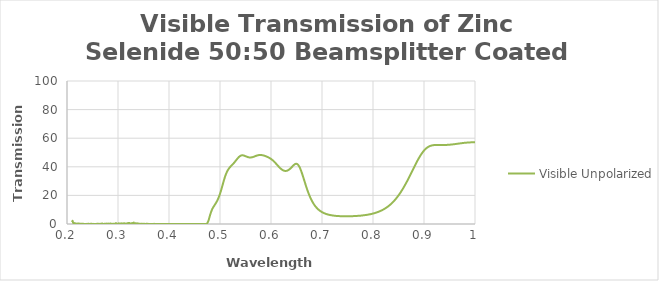
| Category | Visible Unpolarized |
|---|---|
| 0.21 | 1.317 |
| 0.211 | 2.221 |
| 0.212 | 0.77 |
| 0.213 | 0.683 |
| 0.214 | 0.649 |
| 0.215 | 0.59 |
| 0.216 | 0.46 |
| 0.217 | 0.397 |
| 0.218 | 0.26 |
| 0.219 | 0.055 |
| 0.22 | 0.344 |
| 0.221 | 0.15 |
| 0.222 | 0.234 |
| 0.223 | 0.441 |
| 0.224 | 0.07 |
| 0.225 | 0.092 |
| 0.226 | 0.228 |
| 0.227 | 0.069 |
| 0.228 | 0.159 |
| 0.229 | 0.081 |
| 0.23 | 0.14 |
| 0.231 | 0.153 |
| 0.232 | 0.121 |
| 0.233 | 0.033 |
| 0.234 | 0.076 |
| 0.235 | 0.037 |
| 0.236 | 0.044 |
| 0.237 | 0.05 |
| 0.238 | 0.085 |
| 0.239 | 0.085 |
| 0.24 | 0.087 |
| 0.241 | 0.031 |
| 0.242 | 0.12 |
| 0.243 | 0.072 |
| 0.244 | 0.049 |
| 0.245 | 0.101 |
| 0.246 | 0.072 |
| 0.247 | 0.121 |
| 0.248 | 0.109 |
| 0.249 | 0.078 |
| 0.25 | 0.02 |
| 0.251 | 0.117 |
| 0.252 | 0.011 |
| 0.253 | 0.066 |
| 0.254 | 0.064 |
| 0.255 | 0.036 |
| 0.256 | 0.061 |
| 0.257 | 0.031 |
| 0.258 | 0.072 |
| 0.259 | 0.144 |
| 0.26 | 0.174 |
| 0.261 | 0.055 |
| 0.262 | 0.1 |
| 0.263 | 0.116 |
| 0.264 | 0.01 |
| 0.265 | 0.061 |
| 0.266 | 0.132 |
| 0.267 | 0.217 |
| 0.268 | 0.168 |
| 0.269 | 0.366 |
| 0.27 | 0.038 |
| 0.271 | 0.035 |
| 0.272 | 0.074 |
| 0.273 | 0.174 |
| 0.274 | 0.219 |
| 0.275 | 0.103 |
| 0.276 | 0.213 |
| 0.277 | 0.147 |
| 0.278 | 0.303 |
| 0.279 | 0.16 |
| 0.28 | 0.218 |
| 0.281 | 0.156 |
| 0.282 | 0.283 |
| 0.283 | 0.181 |
| 0.284 | 0.256 |
| 0.285 | 0.385 |
| 0.286 | 0.087 |
| 0.287 | 0.161 |
| 0.288 | 0.155 |
| 0.289 | 0.032 |
| 0.29 | 0.147 |
| 0.291 | 0.205 |
| 0.292 | 0.177 |
| 0.293 | 0.085 |
| 0.294 | 0.22 |
| 0.295 | 0.172 |
| 0.296 | 0.655 |
| 0.297 | 0.181 |
| 0.298 | 0.252 |
| 0.299 | 0.174 |
| 0.3 | 0.078 |
| 0.301 | 0.352 |
| 0.302 | 0.469 |
| 0.303 | 0.138 |
| 0.304 | 0.117 |
| 0.305 | 0.117 |
| 0.306 | 0.467 |
| 0.307 | 0.349 |
| 0.308 | 0.213 |
| 0.309 | 0.401 |
| 0.31 | 0.056 |
| 0.311 | 0.335 |
| 0.312 | 0.56 |
| 0.313 | 0.114 |
| 0.314 | 0.092 |
| 0.315 | 0.333 |
| 0.316 | 0.381 |
| 0.317 | 0.302 |
| 0.318 | 0.356 |
| 0.319 | 0.38 |
| 0.32 | 0.73 |
| 0.321 | 0.239 |
| 0.322 | 0.708 |
| 0.323 | 0.597 |
| 0.324 | 0.242 |
| 0.325 | 0.357 |
| 0.326 | 0.419 |
| 0.327 | 0.544 |
| 0.328 | 0.325 |
| 0.329 | 0.709 |
| 0.33 | 0.599 |
| 0.331 | 1.01 |
| 0.332 | 0.335 |
| 0.333 | 0.295 |
| 0.334 | 0.191 |
| 0.335 | 0.61 |
| 0.336 | 0.414 |
| 0.337 | 0.374 |
| 0.338 | 0.343 |
| 0.339 | 0.465 |
| 0.34 | 0.068 |
| 0.341 | 0.136 |
| 0.342 | 0.227 |
| 0.343 | 0.067 |
| 0.344 | 0.051 |
| 0.345 | 0.229 |
| 0.346 | 0.08 |
| 0.347 | 0.141 |
| 0.348 | 0.024 |
| 0.349 | 0.099 |
| 0.35 | 0.104 |
| 0.351 | 0.038 |
| 0.352 | 0.111 |
| 0.353 | 0.086 |
| 0.354 | 0.039 |
| 0.355 | 0.112 |
| 0.356 | 0.074 |
| 0.357 | 0.181 |
| 0.358 | 0.063 |
| 0.359 | 0.088 |
| 0.36 | 0.062 |
| 0.361 | 0.041 |
| 0.362 | 0.068 |
| 0.363 | 0.04 |
| 0.364 | 0.007 |
| 0.365 | 0.061 |
| 0.366 | 0.042 |
| 0.367 | 0.02 |
| 0.368 | 0.034 |
| 0.369 | 0.072 |
| 0.37 | 0.078 |
| 0.371 | 0.101 |
| 0.372 | 0.039 |
| 0.373 | 0.047 |
| 0.374 | 0.014 |
| 0.375 | 0.04 |
| 0.376 | 0.053 |
| 0.377 | 0.031 |
| 0.378 | 0.026 |
| 0.379 | 0.054 |
| 0.38 | 0.056 |
| 0.381 | 0.077 |
| 0.382 | 0.078 |
| 0.383 | 0.039 |
| 0.384 | 0.022 |
| 0.385 | 0.077 |
| 0.386 | 0.024 |
| 0.387 | 0.005 |
| 0.388 | 0.028 |
| 0.389 | 0.031 |
| 0.39 | 0.024 |
| 0.391 | 0.047 |
| 0.392 | 0.022 |
| 0.393 | 0.033 |
| 0.394 | 0.036 |
| 0.395 | 0.054 |
| 0.396 | 0.041 |
| 0.397 | 0.036 |
| 0.398 | 0.005 |
| 0.399 | 0.025 |
| 0.4 | 0.022 |
| 0.401 | 0.031 |
| 0.402 | 0.005 |
| 0.403 | 0.029 |
| 0.404 | 0.032 |
| 0.405 | 0.025 |
| 0.406 | 0.011 |
| 0.407 | 0.023 |
| 0.408 | 0.035 |
| 0.409 | 0.014 |
| 0.41 | 0.03 |
| 0.411 | 0.053 |
| 0.412 | 0.042 |
| 0.413 | 0.015 |
| 0.414 | 0.02 |
| 0.415 | 0.015 |
| 0.416 | 0.045 |
| 0.417 | 0.006 |
| 0.418 | 0.026 |
| 0.419 | 0.03 |
| 0.42 | 0.019 |
| 0.421 | 0.014 |
| 0.422 | 0.008 |
| 0.423 | 0.026 |
| 0.424 | 0.018 |
| 0.425 | 0.01 |
| 0.426 | 0.008 |
| 0.427 | 0.015 |
| 0.428 | 0.016 |
| 0.429 | 0.01 |
| 0.43 | 0.028 |
| 0.431 | 0.001 |
| 0.432 | 0.01 |
| 0.433 | 0.027 |
| 0.434 | 0.019 |
| 0.435 | 0.003 |
| 0.436 | 0.019 |
| 0.437 | 0.025 |
| 0.438 | 0.022 |
| 0.439 | 0.035 |
| 0.44 | 0.01 |
| 0.441 | 0.031 |
| 0.442 | 0.018 |
| 0.443 | 0.029 |
| 0.444 | 0.004 |
| 0.445 | 0.011 |
| 0.446 | 0.011 |
| 0.447 | 0.029 |
| 0.448 | 0.026 |
| 0.449 | 0.014 |
| 0.45 | 0.008 |
| 0.451 | 0.033 |
| 0.452 | 0.015 |
| 0.453 | 0.035 |
| 0.454 | 0.029 |
| 0.455 | 0.01 |
| 0.456 | 0.014 |
| 0.457 | 0.006 |
| 0.458 | 0.012 |
| 0.459 | 0.003 |
| 0.46 | 0.025 |
| 0.461 | 0.038 |
| 0.462 | 0.001 |
| 0.463 | 0.025 |
| 0.464 | 0.015 |
| 0.465 | 0.022 |
| 0.466 | 0.03 |
| 0.467 | 0.025 |
| 0.468 | 0.006 |
| 0.469 | 0.018 |
| 0.47 | 0.031 |
| 0.471 | 0.02 |
| 0.472 | 0.031 |
| 0.473 | 0.052 |
| 0.474 | 0.209 |
| 0.475 | 0.56 |
| 0.476 | 1.153 |
| 0.477 | 1.98 |
| 0.478 | 3.05 |
| 0.479 | 4.266 |
| 0.48 | 5.544 |
| 0.481 | 6.753 |
| 0.482 | 7.889 |
| 0.483 | 8.865 |
| 0.484 | 9.759 |
| 0.485 | 10.554 |
| 0.486 | 11.24 |
| 0.487 | 11.858 |
| 0.488 | 12.453 |
| 0.489 | 12.985 |
| 0.49 | 13.526 |
| 0.491 | 14.083 |
| 0.492 | 14.63 |
| 0.493 | 15.269 |
| 0.494 | 15.914 |
| 0.495 | 16.599 |
| 0.496 | 17.392 |
| 0.497 | 18.22 |
| 0.498 | 19.13 |
| 0.499 | 20.087 |
| 0.5 | 21.113 |
| 0.501 | 22.236 |
| 0.502 | 23.399 |
| 0.503 | 24.612 |
| 0.504 | 25.876 |
| 0.505 | 27.14 |
| 0.506 | 28.432 |
| 0.507 | 29.683 |
| 0.508 | 30.923 |
| 0.509 | 32.092 |
| 0.51 | 33.188 |
| 0.511 | 34.206 |
| 0.512 | 35.119 |
| 0.513 | 35.959 |
| 0.514 | 36.734 |
| 0.515 | 37.385 |
| 0.516 | 37.997 |
| 0.517 | 38.544 |
| 0.518 | 39.04 |
| 0.519 | 39.49 |
| 0.52 | 39.906 |
| 0.521 | 40.302 |
| 0.522 | 40.676 |
| 0.523 | 41.048 |
| 0.524 | 41.399 |
| 0.525 | 41.766 |
| 0.526 | 42.151 |
| 0.527 | 42.565 |
| 0.528 | 42.966 |
| 0.529 | 43.397 |
| 0.53 | 43.839 |
| 0.531 | 44.28 |
| 0.532 | 44.749 |
| 0.533 | 45.207 |
| 0.534 | 45.639 |
| 0.535 | 46.078 |
| 0.536 | 46.463 |
| 0.537 | 46.838 |
| 0.538 | 47.162 |
| 0.539 | 47.43 |
| 0.54 | 47.651 |
| 0.541 | 47.832 |
| 0.542 | 47.957 |
| 0.543 | 48.012 |
| 0.544 | 48.024 |
| 0.545 | 48.018 |
| 0.546 | 47.94 |
| 0.547 | 47.845 |
| 0.548 | 47.724 |
| 0.549 | 47.586 |
| 0.55 | 47.44 |
| 0.551 | 47.276 |
| 0.552 | 47.134 |
| 0.553 | 46.984 |
| 0.554 | 46.871 |
| 0.555 | 46.748 |
| 0.556 | 46.657 |
| 0.557 | 46.577 |
| 0.558 | 46.547 |
| 0.559 | 46.531 |
| 0.56 | 46.539 |
| 0.561 | 46.567 |
| 0.562 | 46.614 |
| 0.563 | 46.69 |
| 0.564 | 46.787 |
| 0.565 | 46.897 |
| 0.566 | 47.021 |
| 0.567 | 47.142 |
| 0.568 | 47.278 |
| 0.569 | 47.421 |
| 0.57 | 47.573 |
| 0.571 | 47.684 |
| 0.572 | 47.817 |
| 0.573 | 47.935 |
| 0.574 | 48.02 |
| 0.575 | 48.103 |
| 0.576 | 48.18 |
| 0.577 | 48.213 |
| 0.578 | 48.246 |
| 0.579 | 48.265 |
| 0.58 | 48.243 |
| 0.581 | 48.221 |
| 0.582 | 48.18 |
| 0.583 | 48.113 |
| 0.584 | 48.039 |
| 0.585 | 47.96 |
| 0.586 | 47.854 |
| 0.587 | 47.753 |
| 0.588 | 47.634 |
| 0.589 | 47.495 |
| 0.59 | 47.362 |
| 0.591 | 47.222 |
| 0.592 | 47.085 |
| 0.593 | 46.903 |
| 0.594 | 46.752 |
| 0.595 | 46.571 |
| 0.596 | 46.374 |
| 0.597 | 46.18 |
| 0.598 | 45.958 |
| 0.599 | 45.742 |
| 0.6 | 45.488 |
| 0.601 | 45.229 |
| 0.602 | 44.954 |
| 0.603 | 44.654 |
| 0.604 | 44.34 |
| 0.605 | 44.026 |
| 0.606 | 43.662 |
| 0.607 | 43.314 |
| 0.608 | 42.939 |
| 0.609 | 42.549 |
| 0.61 | 42.152 |
| 0.611 | 41.757 |
| 0.612 | 41.349 |
| 0.613 | 40.957 |
| 0.614 | 40.558 |
| 0.615 | 40.172 |
| 0.616 | 39.79 |
| 0.617 | 39.437 |
| 0.618 | 39.071 |
| 0.619 | 38.754 |
| 0.62 | 38.446 |
| 0.621 | 38.173 |
| 0.622 | 37.916 |
| 0.623 | 37.699 |
| 0.624 | 37.513 |
| 0.625 | 37.356 |
| 0.626 | 37.234 |
| 0.627 | 37.162 |
| 0.628 | 37.122 |
| 0.629 | 37.116 |
| 0.63 | 37.156 |
| 0.631 | 37.234 |
| 0.632 | 37.341 |
| 0.633 | 37.496 |
| 0.634 | 37.692 |
| 0.635 | 37.933 |
| 0.636 | 38.179 |
| 0.637 | 38.482 |
| 0.638 | 38.799 |
| 0.639 | 39.141 |
| 0.64 | 39.497 |
| 0.641 | 39.891 |
| 0.642 | 40.262 |
| 0.643 | 40.645 |
| 0.644 | 41.019 |
| 0.645 | 41.334 |
| 0.646 | 41.603 |
| 0.647 | 41.843 |
| 0.648 | 42.004 |
| 0.649 | 42.078 |
| 0.65 | 42.06 |
| 0.651 | 41.949 |
| 0.652 | 41.726 |
| 0.653 | 41.405 |
| 0.654 | 40.961 |
| 0.655 | 40.397 |
| 0.656 | 39.741 |
| 0.657 | 38.984 |
| 0.658 | 38.139 |
| 0.659 | 37.217 |
| 0.66 | 36.238 |
| 0.661 | 35.192 |
| 0.662 | 34.107 |
| 0.663 | 32.987 |
| 0.664 | 31.859 |
| 0.665 | 30.694 |
| 0.666 | 29.575 |
| 0.667 | 28.423 |
| 0.668 | 27.302 |
| 0.669 | 26.206 |
| 0.67 | 25.123 |
| 0.671 | 24.077 |
| 0.672 | 23.059 |
| 0.673 | 22.075 |
| 0.674 | 21.134 |
| 0.675 | 20.235 |
| 0.676 | 19.376 |
| 0.677 | 18.571 |
| 0.678 | 17.768 |
| 0.679 | 17.034 |
| 0.68 | 16.334 |
| 0.681 | 15.674 |
| 0.682 | 15.06 |
| 0.683 | 14.436 |
| 0.684 | 13.889 |
| 0.685 | 13.353 |
| 0.686 | 12.849 |
| 0.687 | 12.382 |
| 0.688 | 11.946 |
| 0.689 | 11.533 |
| 0.69 | 11.151 |
| 0.691 | 10.765 |
| 0.692 | 10.428 |
| 0.693 | 10.109 |
| 0.694 | 9.796 |
| 0.695 | 9.516 |
| 0.696 | 9.251 |
| 0.697 | 9.003 |
| 0.698 | 8.749 |
| 0.699 | 8.547 |
| 0.7 | 8.315 |
| 0.701 | 8.115 |
| 0.702 | 7.924 |
| 0.703 | 7.756 |
| 0.704 | 7.607 |
| 0.705 | 7.455 |
| 0.706 | 7.308 |
| 0.707 | 7.163 |
| 0.708 | 7.036 |
| 0.709 | 6.93 |
| 0.71 | 6.816 |
| 0.711 | 6.705 |
| 0.712 | 6.616 |
| 0.713 | 6.501 |
| 0.714 | 6.426 |
| 0.715 | 6.348 |
| 0.716 | 6.263 |
| 0.717 | 6.185 |
| 0.718 | 6.133 |
| 0.719 | 6.066 |
| 0.72 | 6.018 |
| 0.721 | 5.958 |
| 0.722 | 5.881 |
| 0.723 | 5.858 |
| 0.724 | 5.824 |
| 0.725 | 5.759 |
| 0.726 | 5.715 |
| 0.727 | 5.674 |
| 0.728 | 5.666 |
| 0.729 | 5.651 |
| 0.73 | 5.614 |
| 0.731 | 5.565 |
| 0.732 | 5.549 |
| 0.733 | 5.543 |
| 0.734 | 5.515 |
| 0.735 | 5.489 |
| 0.736 | 5.478 |
| 0.737 | 5.462 |
| 0.738 | 5.452 |
| 0.739 | 5.468 |
| 0.74 | 5.452 |
| 0.741 | 5.44 |
| 0.742 | 5.415 |
| 0.743 | 5.425 |
| 0.744 | 5.427 |
| 0.745 | 5.438 |
| 0.746 | 5.393 |
| 0.747 | 5.401 |
| 0.748 | 5.41 |
| 0.749 | 5.416 |
| 0.75 | 5.406 |
| 0.751 | 5.415 |
| 0.752 | 5.399 |
| 0.753 | 5.416 |
| 0.754 | 5.459 |
| 0.755 | 5.424 |
| 0.756 | 5.436 |
| 0.757 | 5.432 |
| 0.758 | 5.455 |
| 0.759 | 5.495 |
| 0.76 | 5.487 |
| 0.761 | 5.501 |
| 0.762 | 5.524 |
| 0.763 | 5.535 |
| 0.764 | 5.547 |
| 0.765 | 5.57 |
| 0.766 | 5.594 |
| 0.767 | 5.621 |
| 0.768 | 5.618 |
| 0.769 | 5.659 |
| 0.77 | 5.687 |
| 0.771 | 5.713 |
| 0.772 | 5.731 |
| 0.773 | 5.792 |
| 0.774 | 5.777 |
| 0.775 | 5.832 |
| 0.776 | 5.848 |
| 0.777 | 5.93 |
| 0.778 | 5.924 |
| 0.779 | 5.986 |
| 0.78 | 6.021 |
| 0.781 | 6.065 |
| 0.782 | 6.094 |
| 0.783 | 6.169 |
| 0.784 | 6.207 |
| 0.785 | 6.223 |
| 0.786 | 6.287 |
| 0.787 | 6.344 |
| 0.788 | 6.411 |
| 0.789 | 6.472 |
| 0.79 | 6.507 |
| 0.791 | 6.608 |
| 0.792 | 6.674 |
| 0.793 | 6.751 |
| 0.794 | 6.83 |
| 0.795 | 6.843 |
| 0.796 | 6.968 |
| 0.797 | 7.026 |
| 0.798 | 7.106 |
| 0.799 | 7.237 |
| 0.8 | 7.313 |
| 0.801 | 7.412 |
| 0.802 | 7.491 |
| 0.803 | 7.6 |
| 0.804 | 7.716 |
| 0.805 | 7.841 |
| 0.806 | 7.948 |
| 0.807 | 8.045 |
| 0.808 | 8.158 |
| 0.809 | 8.319 |
| 0.81 | 8.438 |
| 0.811 | 8.576 |
| 0.812 | 8.726 |
| 0.813 | 8.867 |
| 0.814 | 9.034 |
| 0.815 | 9.199 |
| 0.816 | 9.359 |
| 0.817 | 9.521 |
| 0.818 | 9.706 |
| 0.819 | 9.891 |
| 0.82 | 10.077 |
| 0.821 | 10.258 |
| 0.822 | 10.487 |
| 0.823 | 10.703 |
| 0.824 | 10.928 |
| 0.825 | 11.141 |
| 0.826 | 11.397 |
| 0.827 | 11.62 |
| 0.828 | 11.886 |
| 0.829 | 12.127 |
| 0.83 | 12.423 |
| 0.831 | 12.699 |
| 0.832 | 12.977 |
| 0.833 | 13.283 |
| 0.834 | 13.577 |
| 0.835 | 13.888 |
| 0.836 | 14.223 |
| 0.837 | 14.574 |
| 0.838 | 14.92 |
| 0.839 | 15.286 |
| 0.84 | 15.66 |
| 0.841 | 16.018 |
| 0.842 | 16.433 |
| 0.843 | 16.846 |
| 0.844 | 17.249 |
| 0.845 | 17.675 |
| 0.846 | 18.105 |
| 0.847 | 18.549 |
| 0.848 | 19.01 |
| 0.849 | 19.504 |
| 0.85 | 19.981 |
| 0.851 | 20.482 |
| 0.852 | 20.993 |
| 0.853 | 21.512 |
| 0.854 | 22.047 |
| 0.855 | 22.6 |
| 0.856 | 23.184 |
| 0.857 | 23.72 |
| 0.858 | 24.307 |
| 0.859 | 24.909 |
| 0.86 | 25.489 |
| 0.861 | 26.134 |
| 0.862 | 26.785 |
| 0.863 | 27.388 |
| 0.864 | 28.053 |
| 0.865 | 28.686 |
| 0.866 | 29.341 |
| 0.867 | 30.007 |
| 0.868 | 30.705 |
| 0.869 | 31.407 |
| 0.87 | 32.079 |
| 0.871 | 32.78 |
| 0.872 | 33.482 |
| 0.873 | 34.189 |
| 0.874 | 34.918 |
| 0.875 | 35.662 |
| 0.876 | 36.364 |
| 0.877 | 37.08 |
| 0.878 | 37.814 |
| 0.879 | 38.486 |
| 0.88 | 39.248 |
| 0.881 | 39.978 |
| 0.882 | 40.665 |
| 0.883 | 41.386 |
| 0.884 | 42.084 |
| 0.885 | 42.774 |
| 0.886 | 43.462 |
| 0.887 | 44.156 |
| 0.888 | 44.823 |
| 0.889 | 45.454 |
| 0.89 | 46.084 |
| 0.891 | 46.695 |
| 0.892 | 47.283 |
| 0.893 | 47.876 |
| 0.894 | 48.444 |
| 0.895 | 48.959 |
| 0.896 | 49.494 |
| 0.897 | 49.98 |
| 0.898 | 50.432 |
| 0.899 | 50.903 |
| 0.9 | 51.342 |
| 0.901 | 51.73 |
| 0.902 | 52.108 |
| 0.903 | 52.451 |
| 0.904 | 52.771 |
| 0.905 | 53.07 |
| 0.906 | 53.357 |
| 0.907 | 53.613 |
| 0.908 | 53.832 |
| 0.909 | 54.041 |
| 0.91 | 54.227 |
| 0.911 | 54.388 |
| 0.912 | 54.545 |
| 0.913 | 54.678 |
| 0.914 | 54.787 |
| 0.915 | 54.888 |
| 0.916 | 54.967 |
| 0.917 | 55.039 |
| 0.918 | 55.104 |
| 0.919 | 55.157 |
| 0.92 | 55.202 |
| 0.921 | 55.233 |
| 0.922 | 55.254 |
| 0.923 | 55.276 |
| 0.924 | 55.292 |
| 0.925 | 55.3 |
| 0.926 | 55.305 |
| 0.927 | 55.309 |
| 0.928 | 55.307 |
| 0.929 | 55.295 |
| 0.93 | 55.299 |
| 0.931 | 55.292 |
| 0.932 | 55.29 |
| 0.933 | 55.289 |
| 0.934 | 55.278 |
| 0.935 | 55.26 |
| 0.936 | 55.261 |
| 0.937 | 55.266 |
| 0.938 | 55.26 |
| 0.939 | 55.259 |
| 0.94 | 55.267 |
| 0.941 | 55.269 |
| 0.942 | 55.276 |
| 0.943 | 55.291 |
| 0.944 | 55.309 |
| 0.945 | 55.324 |
| 0.946 | 55.348 |
| 0.947 | 55.369 |
| 0.948 | 55.39 |
| 0.949 | 55.417 |
| 0.95 | 55.451 |
| 0.951 | 55.478 |
| 0.952 | 55.512 |
| 0.953 | 55.55 |
| 0.954 | 55.585 |
| 0.955 | 55.623 |
| 0.956 | 55.668 |
| 0.957 | 55.712 |
| 0.958 | 55.752 |
| 0.959 | 55.8 |
| 0.96 | 55.846 |
| 0.961 | 55.894 |
| 0.962 | 55.941 |
| 0.963 | 55.991 |
| 0.964 | 56.038 |
| 0.965 | 56.086 |
| 0.966 | 56.136 |
| 0.967 | 56.184 |
| 0.968 | 56.232 |
| 0.969 | 56.286 |
| 0.97 | 56.335 |
| 0.971 | 56.379 |
| 0.972 | 56.428 |
| 0.973 | 56.471 |
| 0.974 | 56.514 |
| 0.975 | 56.564 |
| 0.976 | 56.61 |
| 0.977 | 56.665 |
| 0.978 | 56.703 |
| 0.979 | 56.75 |
| 0.98 | 56.778 |
| 0.981 | 56.813 |
| 0.982 | 56.852 |
| 0.983 | 56.883 |
| 0.984 | 56.91 |
| 0.985 | 56.948 |
| 0.986 | 56.972 |
| 0.987 | 56.995 |
| 0.988 | 57.024 |
| 0.989 | 57.047 |
| 0.99 | 57.066 |
| 0.991 | 57.076 |
| 0.992 | 57.104 |
| 0.993 | 57.114 |
| 0.994 | 57.127 |
| 0.995 | 57.134 |
| 0.996 | 57.139 |
| 0.997 | 57.144 |
| 0.998 | 57.15 |
| 0.999 | 57.159 |
| 1.0 | 57.151 |